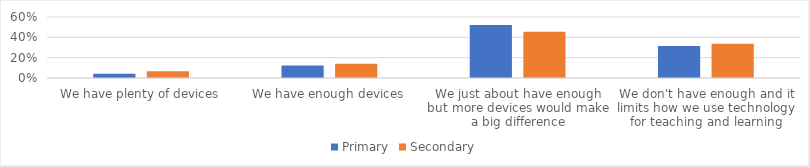
| Category | Primary | Secondary |
|---|---|---|
| We have plenty of devices | 0.041 | 0.066 |
| We have enough devices | 0.124 | 0.14 |
| We just about have enough but more devices would make a big difference | 0.521 | 0.456 |
| We don't have enough and it limits how we use technology for teaching and learning | 0.314 | 0.338 |